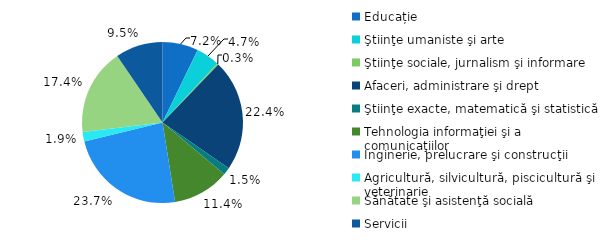
| Category | Series 0 |
|---|---|
| Educație | 7.2 |
| Ştiinţe umaniste şi arte | 4.7 |
| Ştiinţe sociale, jurnalism şi informare | 0.3 |
| Afaceri, administrare şi drept | 22.4 |
| Ştiinţe exacte, matematică şi statistică | 1.5 |
| Tehnologia informaţiei şi a comunicaţiilor | 11.4 |
| Inginerie, prelucrare şi construcţii | 23.7 |
| Agricultură, silvicultură, piscicultură şi veterinarie | 1.9 |
| Sănătate şi asistenţă socială | 17.4 |
| Servicii | 9.5 |